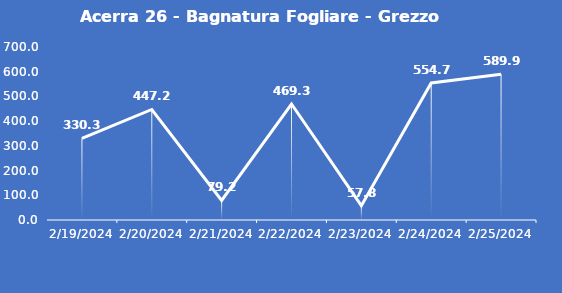
| Category | Acerra 26 - Bagnatura Fogliare - Grezzo (min) |
|---|---|
| 2/19/24 | 330.3 |
| 2/20/24 | 447.2 |
| 2/21/24 | 79.2 |
| 2/22/24 | 469.3 |
| 2/23/24 | 57.8 |
| 2/24/24 | 554.7 |
| 2/25/24 | 589.9 |